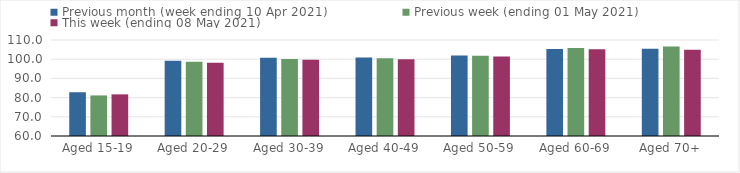
| Category | Previous month (week ending 10 Apr 2021) | Previous week (ending 01 May 2021) | This week (ending 08 May 2021) |
|---|---|---|---|
| Aged 15-19 | 82.79 | 81.13 | 81.69 |
| Aged 20-29 | 99.18 | 98.66 | 98.2 |
| Aged 30-39 | 100.79 | 100.16 | 99.65 |
| Aged 40-49 | 100.88 | 100.46 | 100.03 |
| Aged 50-59 | 101.99 | 101.77 | 101.47 |
| Aged 60-69 | 105.33 | 105.77 | 105.24 |
| Aged 70+ | 105.47 | 106.66 | 104.95 |